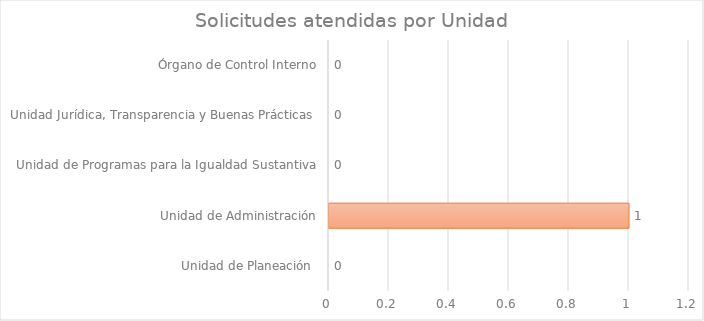
| Category | Series 1 |
|---|---|
| Unidad de Planeación  | 0 |
| Unidad de Administración | 1 |
| Unidad de Programas para la Igualdad Sustantiva | 0 |
| Unidad Jurídica, Transparencia y Buenas Prácticas  | 0 |
| Órgano de Control Interno | 0 |